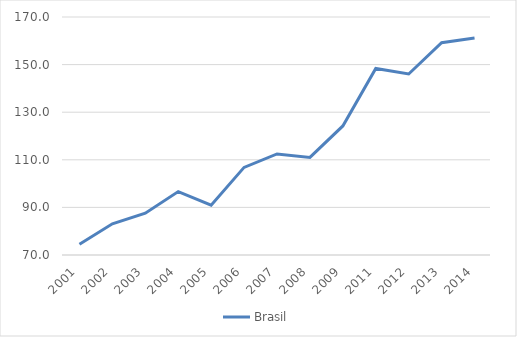
| Category | Brasil |
|---|---|
| 2001.0 | 74.53 |
| 2002.0 | 83.092 |
| 2003.0 | 87.545 |
| 2004.0 | 96.651 |
| 2005.0 | 90.93 |
| 2006.0 | 106.812 |
| 2007.0 | 112.466 |
| 2008.0 | 111.013 |
| 2009.0 | 124.225 |
| 2011.0 | 148.383 |
| 2012.0 | 146.057 |
| 2013.0 | 159.169 |
| 2014.0 | 161.157 |